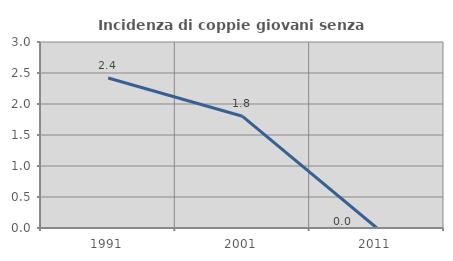
| Category | Incidenza di coppie giovani senza figli |
|---|---|
| 1991.0 | 2.419 |
| 2001.0 | 1.802 |
| 2011.0 | 0 |